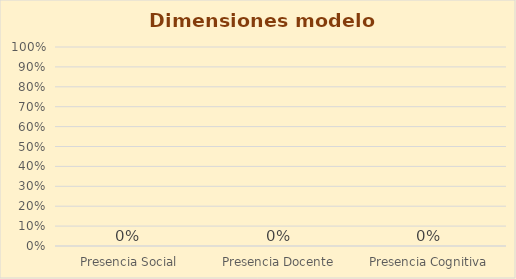
| Category | Series 0 |
|---|---|
| Presencia Social | 0 |
| Presencia Docente | 0 |
| Presencia Cognitiva | 0 |